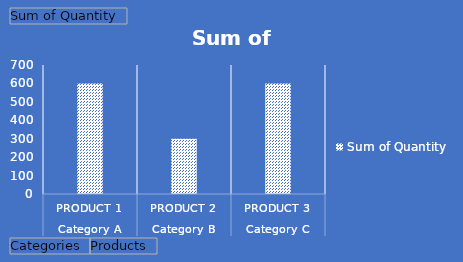
| Category | Celková hodnota |
|---|---|
| 0 | 600 |
| 1 | 300 |
| 2 | 600 |